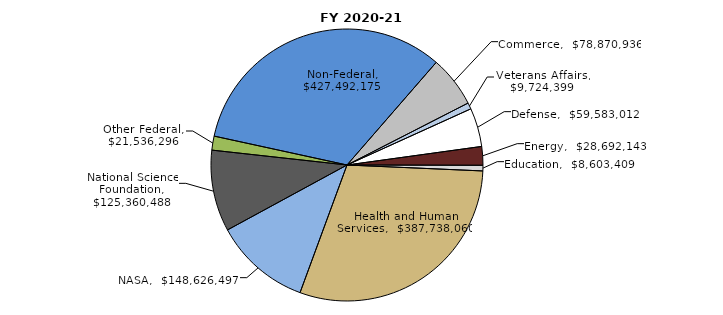
| Category | Series 0 |
|---|---|
| Commerce | 78870936 |
| Veterans Affairs | 9724399 |
| Defense | 59583012 |
| Energy | 28692143 |
| Education | 8603409 |
| Health and Human Services | 387738060 |
| NASA | 148626497 |
| National Science Foundation | 125360488 |
| Other Federal | 21536296 |
| Non-Federal | 427492175 |